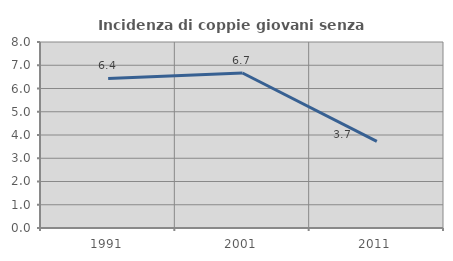
| Category | Incidenza di coppie giovani senza figli |
|---|---|
| 1991.0 | 6.435 |
| 2001.0 | 6.667 |
| 2011.0 | 3.727 |